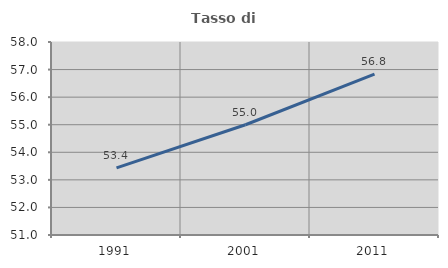
| Category | Tasso di occupazione   |
|---|---|
| 1991.0 | 53.436 |
| 2001.0 | 54.999 |
| 2011.0 | 56.833 |